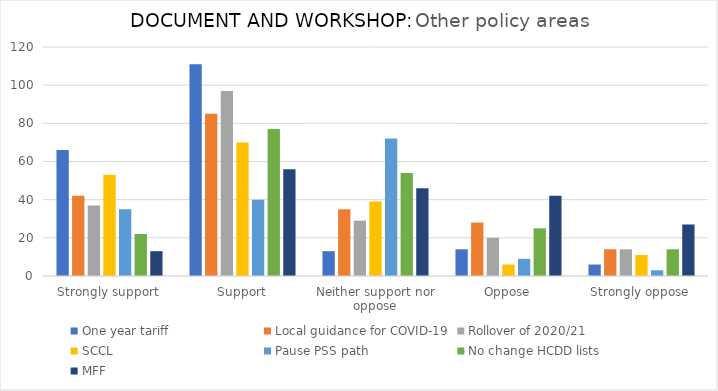
| Category | One year tariff | Local guidance for COVID-19 | Rollover of 2020/21 | SCCL | Pause PSS path | No change HCDD lists | MFF |
|---|---|---|---|---|---|---|---|
| Strongly support | 66 | 42 | 37 | 53 | 35 | 22 | 13 |
| Support | 111 | 85 | 97 | 70 | 40 | 77 | 56 |
| Neither support nor oppose | 13 | 35 | 29 | 39 | 72 | 54 | 46 |
| Oppose | 14 | 28 | 20 | 6 | 9 | 25 | 42 |
| Strongly oppose | 6 | 14 | 14 | 11 | 3 | 14 | 27 |